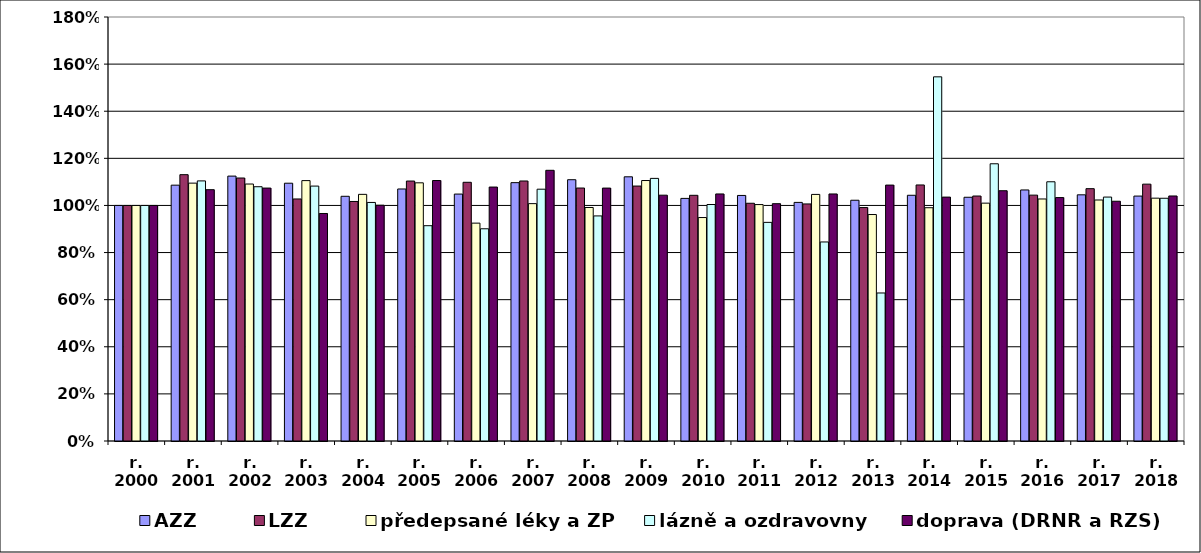
| Category | AZZ | LZZ | předepsané léky a ZP | lázně a ozdravovny | doprava (DRNR a RZS) |
|---|---|---|---|---|---|
| r. 2000 | 1 | 1 | 1 | 1 | 1 |
| r. 2001 | 1.086 | 1.131 | 1.095 | 1.104 | 1.067 |
| r. 2002 | 1.125 | 1.117 | 1.091 | 1.079 | 1.074 |
| r. 2003 | 1.094 | 1.028 | 1.105 | 1.082 | 0.966 |
| r. 2004 | 1.039 | 1.017 | 1.047 | 1.013 | 1.001 |
| r. 2005 | 1.07 | 1.104 | 1.096 | 0.914 | 1.106 |
| r. 2006 | 1.048 | 1.098 | 0.925 | 0.901 | 1.078 |
| r. 2007 | 1.097 | 1.104 | 1.008 | 1.069 | 1.149 |
| r. 2008 | 1.109 | 1.074 | 0.991 | 0.956 | 1.074 |
| r. 2009 | 1.122 | 1.082 | 1.106 | 1.115 | 1.044 |
| r. 2010 | 1.03 | 1.043 | 0.949 | 1.004 | 1.049 |
| r. 2011 | 1.042 | 1.009 | 1.004 | 0.928 | 1.008 |
| r. 2012 | 1.013 | 1.006 | 1.047 | 0.845 | 1.049 |
| r. 2013 | 1.022 | 0.991 | 0.961 | 0.628 | 1.086 |
| r. 2014 | 1.043 | 1.087 | 0.99 | 1.546 | 1.035 |
| r. 2015 | 1.035 | 1.04 | 1.01 | 1.177 | 1.062 |
| r. 2016 | 1.066 | 1.044 | 1.027 | 1.101 | 1.033 |
| r. 2017 | 1.045 | 1.071 | 1.023 | 1.036 | 1.018 |
| r. 2018 | 1.04 | 1.09 | 1.031 | 1.031 | 1.04 |